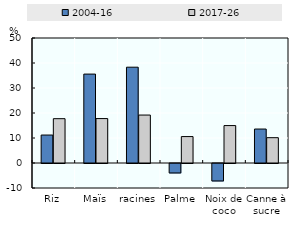
| Category | 2004-16 | 2017-26 |
|---|---|---|
| Riz | 11.185 | 17.726 |
| Maïs | 35.564 | 17.772 |
| racines | 38.319 | 19.178 |
| Palme | -3.782 | 10.569 |
| Noix de coco | -6.982 | 14.97 |
| Canne à sucre | 13.585 | 10.126 |